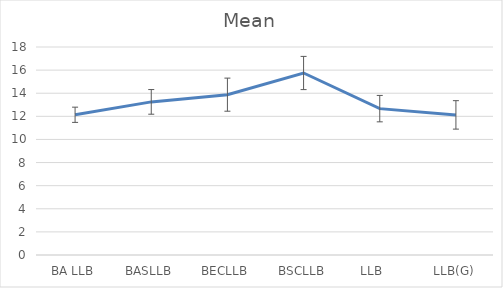
| Category | Mean |
|---|---|
| BA LLB | 12.135 |
| BASLLB | 13.25 |
| BECLLB | 13.875 |
| BSCLLB | 15.75 |
| LLB    | 12.667 |
| LLB(G) | 12.125 |